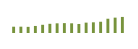
| Category | Saldo [ (1)-(2) ] |
|---|---|
| 0 | 203117.024 |
| 1 | 204244.864 |
| 2 | 198400.412 |
| 3 | 227324.117 |
| 4 | 264760.339 |
| 5 | 296419.004 |
| 6 | 312165.442 |
| 7 | 318321.614 |
| 8 | 312463.312 |
| 9 | 291587.274 |
| 10 | 334649.348 |
| 11 | 344816.778 |
| 12 | 363008.511 |
| 13 | 460327.444 |
| 14 | 495580.342 |
| 15 | 518438.628 |